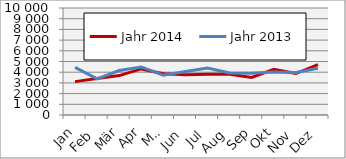
| Category | Jahr 2014 | Jahr 2013 |
|---|---|---|
| Jan | 3118.78 | 4444.821 |
| Feb | 3401.476 | 3376.275 |
| Mär | 3681.86 | 4157.769 |
| Apr | 4305.495 | 4489.111 |
| Mai | 3857.643 | 3724.229 |
| Jun | 3772.734 | 4058.324 |
| Jul | 3811.881 | 4393.397 |
| Aug | 3805.678 | 3927.358 |
| Sep | 3508.051 | 3913.36 |
| Okt | 4260.707 | 4028.493 |
| Nov | 3875.256 | 3982.586 |
| Dez | 4707.8 | 4365.277 |